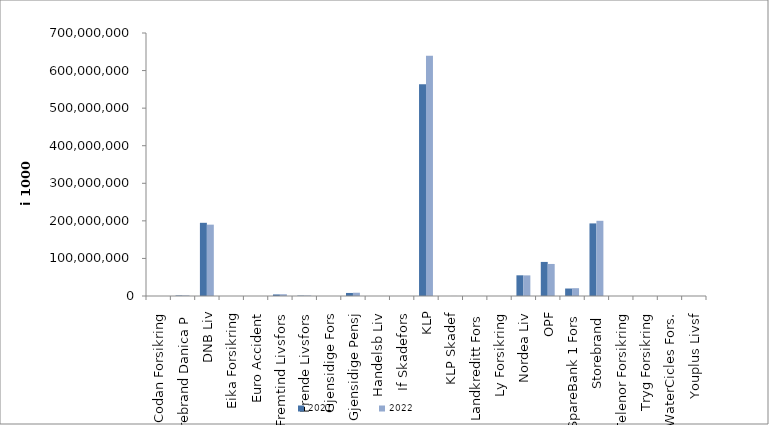
| Category | 2021 | 2022 |
|---|---|---|
| Codan Forsikring | 0 | 0 |
| Storebrand Danica P | 1370247.215 | 1511060.234 |
| DNB Liv | 194803582.387 | 189898877.812 |
| Eika Forsikring | 0 | 0 |
| Euro Accident | 0 | 0 |
| Fremtind Livsfors | 4152805.498 | 4663711.953 |
| Frende Livsfors | 1050664 | 1264435 |
| Gjensidige Fors | 0 | 0 |
| Gjensidige Pensj | 8107520.2 | 8716977 |
| Handelsb Liv | 21229.508 | 1519.595 |
| If Skadefors | 0 | 0 |
| KLP | 563319210.352 | 639219292.353 |
| KLP Skadef | 69834.293 | 99044.308 |
| Landkreditt Fors | 0 | 0 |
| Ly Forsikring | 0 | 0 |
| Nordea Liv | 55059961 | 54880190 |
| OPF | 90681751 | 85289000 |
| SpareBank 1 Fors | 19914575.503 | 20801168.006 |
| Storebrand  | 193217678.73 | 200165633.337 |
| Telenor Forsikring | 0 | 0 |
| Tryg Forsikring | 0 | 0 |
| WaterCicles Fors. | 0 | 0 |
| Youplus Livsf | 0 | 3017 |